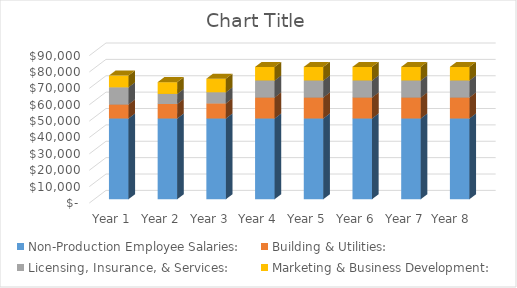
| Category | Non-Production Employee Salaries: | Building & Utilities:  | Licensing, Insurance, & Services:  | Marketing & Business Development:  |
|---|---|---|---|---|
| Year 1 | 49308.48 | 8550 | 10450 | 7200 |
| Year 2 | 49308.48 | 8820 | 6150 | 7200 |
| Year 3 | 49308.48 | 9225 | 6750 | 8300 |
| Year 4 | 49308.48 | 12825 | 10350 | 8300 |
| Year 5 | 49308.48 | 12825 | 10350 | 8300 |
| Year 6 | 49308.48 | 12825 | 10350 | 8300 |
| Year 7 | 49308.48 | 12825 | 10350 | 8300 |
| Year 8  | 49308.48 | 12825 | 10350 | 8300 |